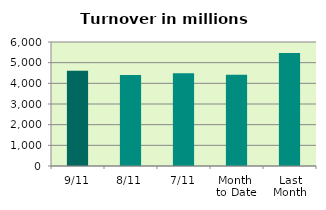
| Category | Series 0 |
|---|---|
| 9/11 | 4608.402 |
| 8/11 | 4399.906 |
| 7/11 | 4482.882 |
| Month 
to Date | 4420.281 |
| Last
Month | 5472.473 |